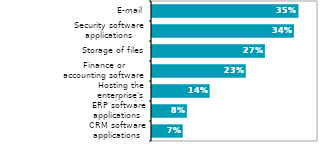
| Category | Series 0 |
|---|---|
| CRM software applications | 0.074 |
| ERP software applications  | 0.084 |
| Hosting the enterprise's database(s) | 0.139 |
| Finance or accounting software apps | 0.226 |
| Storage of files | 0.272 |
| Security software applications | 0.342 |
| E-mail | 0.353 |